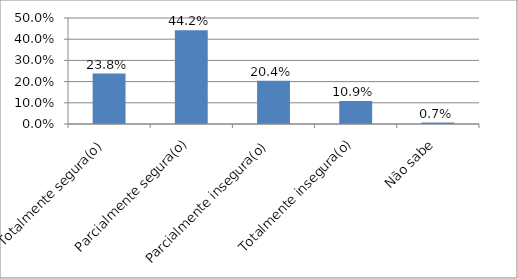
| Category | Series 0 |
|---|---|
| Totalmente segura(o) | 0.238 |
| Parcialmente segura(o) | 0.442 |
| Parcialmente insegura(o) | 0.204 |
| Totalmente insegura(o) | 0.109 |
| Não sabe | 0.007 |